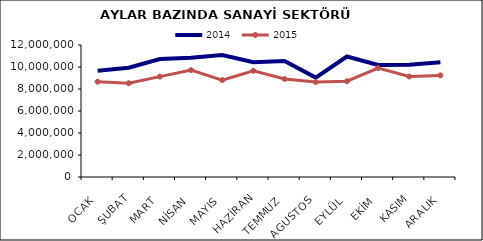
| Category | 2014 | 2015 |
|---|---|---|
| OCAK | 9648900.196 | 8663206.127 |
| ŞUBAT | 9937642.999 | 8524416.452 |
| MART | 10721892.682 | 9127559.898 |
| NİSAN | 10843988.776 | 9713757.3 |
| MAYIS | 11089447.478 | 8809139.195 |
| HAZİRAN | 10432193.44 | 9654682.851 |
| TEMMUZ | 10539153.38 | 8905866.163 |
| AGUSTOS | 9039360.059 | 8639468.174 |
| EYLÜL | 10951683.774 | 8705312.791 |
| EKİM | 10188349.294 | 9896217.213 |
| KASIM | 10199204.126 | 9135087.651 |
| ARALIK | 10442420.745 | 9237422.026 |